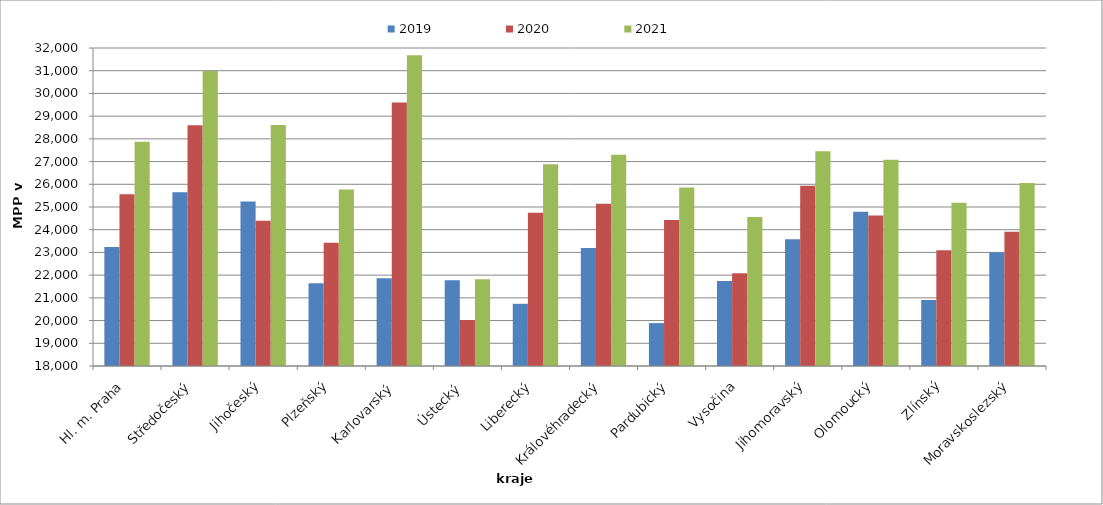
| Category | 2019 | 2020 | 2021 |
|---|---|---|---|
| Hl. m. Praha | 23244.082 | 25565.896 | 27868.253 |
| Středočeský | 25646.429 | 28594.286 | 30982.722 |
| Jihočeský | 25244.177 | 24397.85 | 28614.05 |
| Plzeňský | 21641.401 | 23427.914 | 25770.831 |
| Karlovarský  | 21866.667 | 29600 | 31680 |
| Ústecký   | 21777.804 | 20022.541 | 21824.385 |
| Liberecký | 20738.479 | 24745.275 | 26885.263 |
| Královéhradecký | 23195.782 | 25143.707 | 27305.722 |
| Pardubický | 19888.37 | 24427.708 | 25861.002 |
| Vysočina | 21742.224 | 22085.259 | 24564.175 |
| Jihomoravský | 23575.491 | 25938.728 | 27452.948 |
| Olomoucký | 24794.074 | 24623.385 | 27085.523 |
| Zlínský | 20900.288 | 23096.467 | 25185.836 |
| Moravskoslezský | 22994.941 | 23912.194 | 26058.161 |